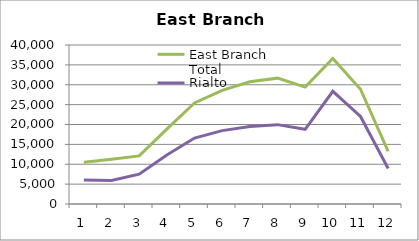
| Category | East Branch Total | Rialto |
|---|---|---|
| 0 | 10493.508 | 6018.137 |
| 1 | 11265.485 | 5933.622 |
| 2 | 12105.143 | 7501.322 |
| 3 | 18839.946 | 12328.37 |
| 4 | 25412.032 | 16584.588 |
| 5 | 28600.922 | 18461.563 |
| 6 | 30764.038 | 19480.449 |
| 7 | 31659.662 | 19965.394 |
| 8 | 29408.458 | 18794.553 |
| 9 | 36615.704 | 28347.023 |
| 10 | 28866.273 | 22030.622 |
| 11 | 13218.286 | 8950.435 |